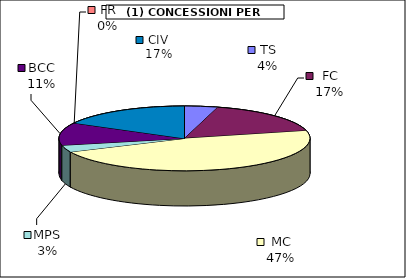
| Category | Series 0 |
|---|---|
| TS | 4066.75 |
| FC | 16097.25 |
| MC | 44647.5 |
| MPS | 3250 |
| BCC | 10759 |
| FR | 0 |
| CIV | 16240.5 |